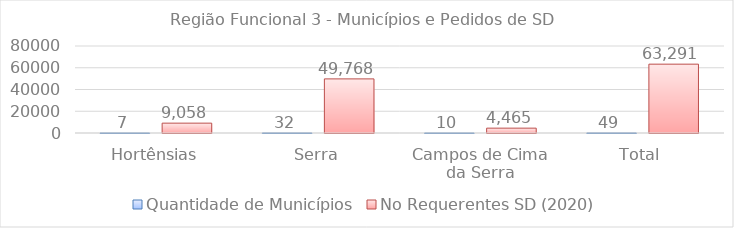
| Category | Quantidade de Municípios | No Requerentes SD (2020) |
|---|---|---|
| Hortênsias | 7 | 9058 |
| Serra | 32 | 49768 |
| Campos de Cima da Serra | 10 | 4465 |
| Total | 49 | 63291 |